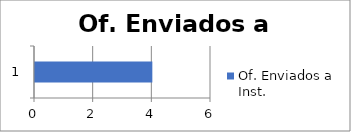
| Category | Of. Enviados a Inst.  |
|---|---|
| 0 | 4 |